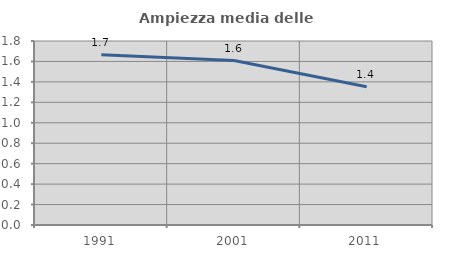
| Category | Ampiezza media delle famiglie |
|---|---|
| 1991.0 | 1.667 |
| 2001.0 | 1.609 |
| 2011.0 | 1.353 |